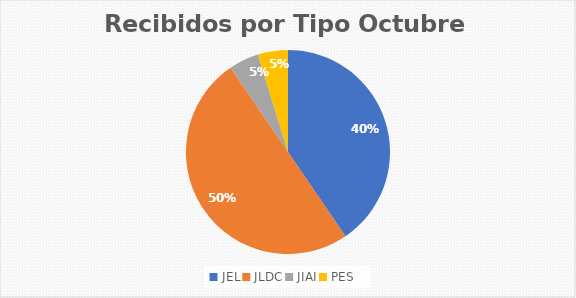
| Category | Series 0 |
|---|---|
| JEL | 17 |
| JLDC | 21 |
| JIAI | 2 |
| PES | 2 |